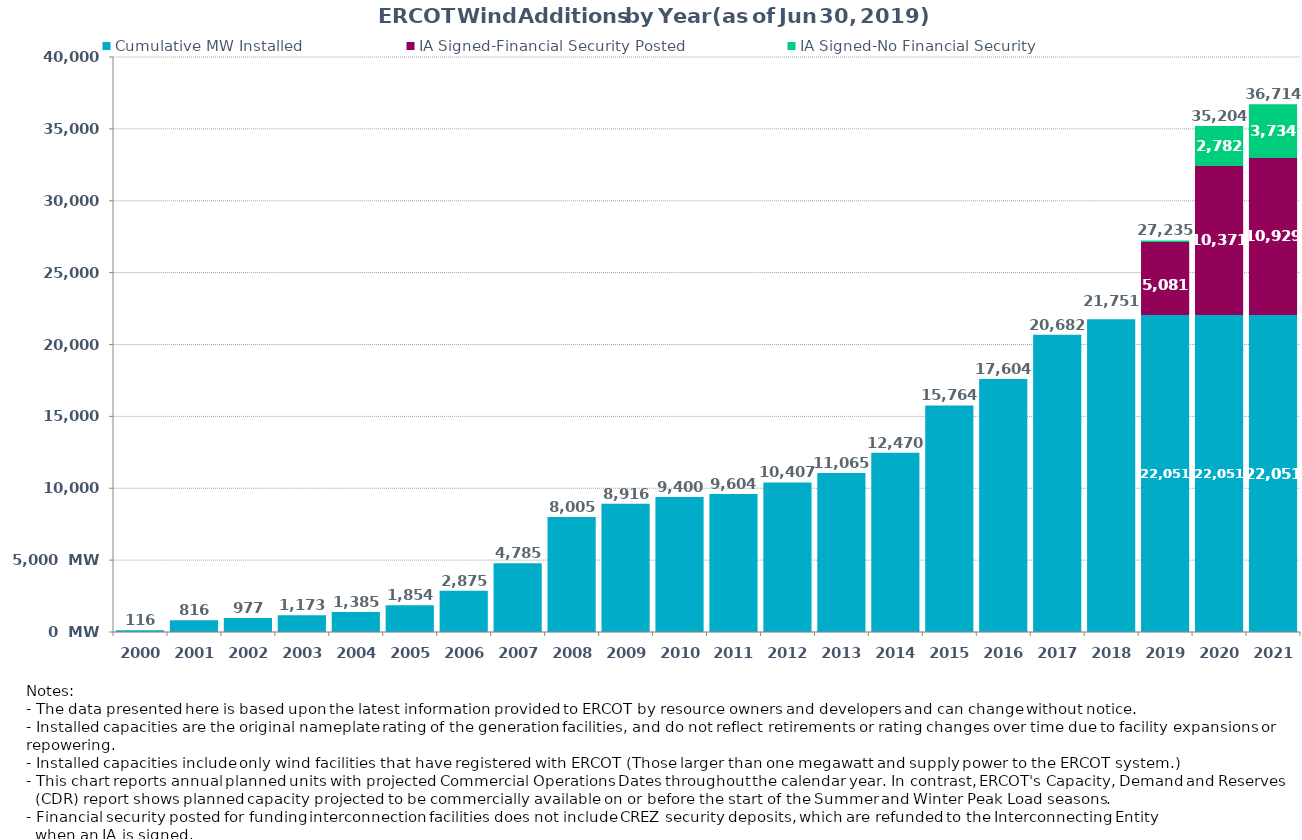
| Category | Cumulative MW Installed | IA Signed-Financial Security Posted  | IA Signed-No Financial Security  | Cumulative Installed and Planned |
|---|---|---|---|---|
| 2000.0 | 116 | 0 | 0 | 116 |
| 2001.0 | 816 | 0 | 0 | 816 |
| 2002.0 | 977 | 0 | 0 | 977 |
| 2003.0 | 1173 | 0 | 0 | 1173 |
| 2004.0 | 1385 | 0 | 0 | 1385 |
| 2005.0 | 1854 | 0 | 0 | 1854 |
| 2006.0 | 2875 | 0 | 0 | 2875 |
| 2007.0 | 4785 | 0 | 0 | 4785 |
| 2008.0 | 8005 | 0 | 0 | 8005 |
| 2009.0 | 8916 | 0 | 0 | 8916 |
| 2010.0 | 9400 | 0 | 0 | 9400 |
| 2011.0 | 9604 | 0 | 0 | 9604 |
| 2012.0 | 10407 | 0 | 0 | 10407 |
| 2013.0 | 11065 | 0 | 0 | 11065 |
| 2014.0 | 12470 | 0 | 0 | 12470 |
| 2015.0 | 15764 | 0 | 0 | 15764 |
| 2016.0 | 17604 | 0 | 0 | 17604 |
| 2017.0 | 20682 | 0 | 0 | 20682 |
| 2018.0 | 21751 | 0 | 0 | 21751 |
| 2019.0 | 22051 | 5080.68 | 103.5 | 27235.18 |
| 2020.0 | 22051 | 10371.29 | 2781.9 | 35204.19 |
| 2021.0 | 22051 | 10929.09 | 3733.85 | 36713.94 |